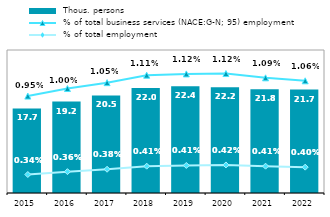
| Category |  Thous. persons |
|---|---|
| 2015.0 | 17.733 |
| 2016.0 | 19.175 |
| 2017.0 | 20.459 |
| 2018.0 | 22.009 |
| 2019.0 | 22.374 |
| 2020.0 | 22.19 |
| 2021.0 | 21.769 |
| 2022.0 | 21.689 |